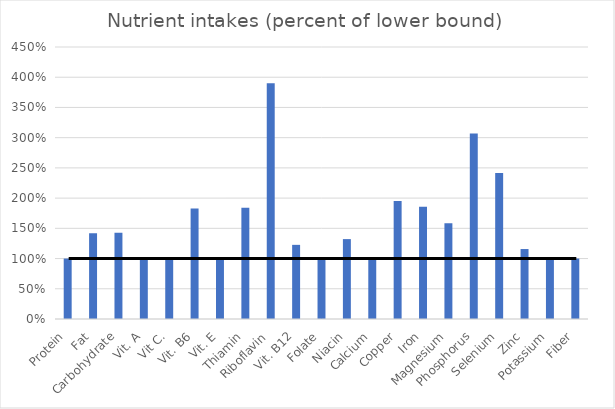
| Category | Series 0 |
|---|---|
| 0 | 1 |
| 1 | 1.417 |
| 2 | 1.426 |
| 3 | 1 |
| 4 | 1 |
| 5 | 1.826 |
| 6 | 1 |
| 7 | 1.842 |
| 8 | 3.9 |
| 9 | 1.227 |
| 10 | 1 |
| 11 | 1.322 |
| 12 | 1 |
| 13 | 1.954 |
| 14 | 1.858 |
| 15 | 1.583 |
| 16 | 3.07 |
| 17 | 2.414 |
| 18 | 1.157 |
| 19 | 1.022 |
| 20 | 1 |